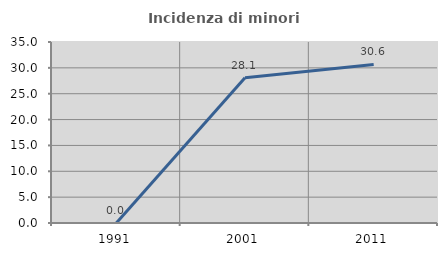
| Category | Incidenza di minori stranieri |
|---|---|
| 1991.0 | 0 |
| 2001.0 | 28.082 |
| 2011.0 | 30.649 |